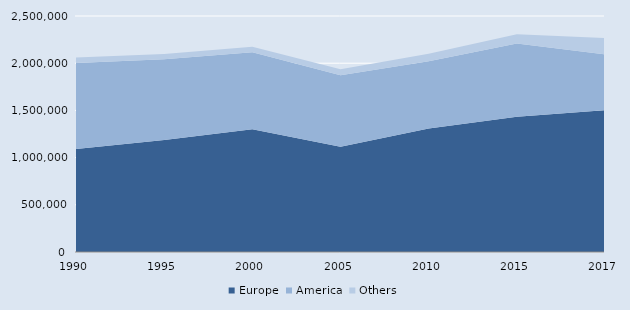
| Category | Europe | America | Others |
|---|---|---|---|
| 1990.0 | 1092141 | 910907 | 57742 |
| 1995.0 | 1187356 | 853198 | 56635 |
| 2000.0 | 1301084 | 815315 | 58045 |
| 2005.0 | 1114618 | 758905 | 62543 |
| 2010.0 | 1308130 | 712886 | 77881 |
| 2015.0 | 1433482 | 775050 | 97789 |
| 2017.0 | 1502151 | 592642 | 171942 |